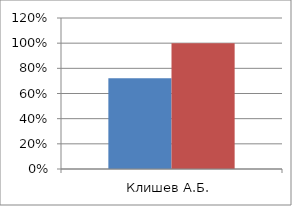
| Category | Series 0 | 2 |
|---|---|---|
| Клишев А.Б. | 0.722 | 1 |